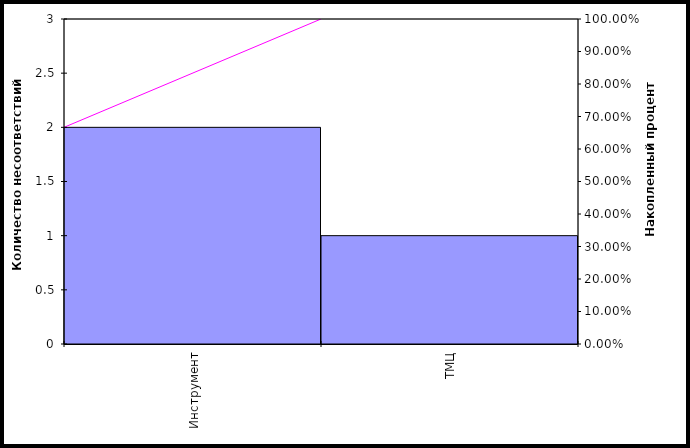
| Category | Series 1 |
|---|---|
| Инструмент | 2 |
| ТМЦ | 1 |